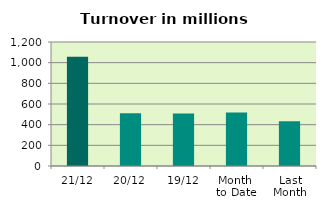
| Category | Series 0 |
|---|---|
| 21/12 | 1057.936 |
| 20/12 | 510.389 |
| 19/12 | 507.93 |
| Month 
to Date | 517.619 |
| Last
Month | 433.001 |